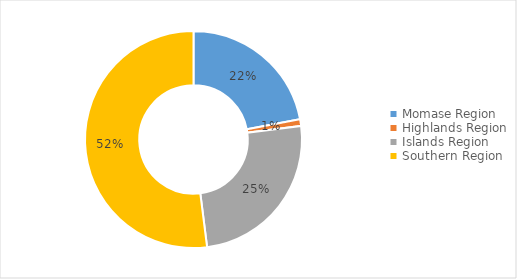
| Category | Concession percentage |
|---|---|
| Momase Region | 0.22 |
| Highlands Region | 0.01 |
| Islands Region | 0.25 |
| Southern Region | 0.52 |